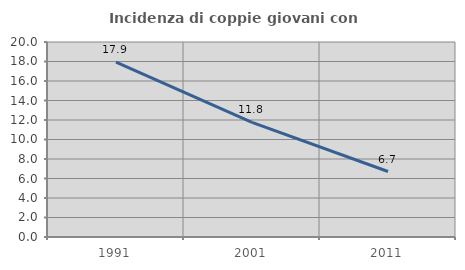
| Category | Incidenza di coppie giovani con figli |
|---|---|
| 1991.0 | 17.936 |
| 2001.0 | 11.765 |
| 2011.0 | 6.716 |